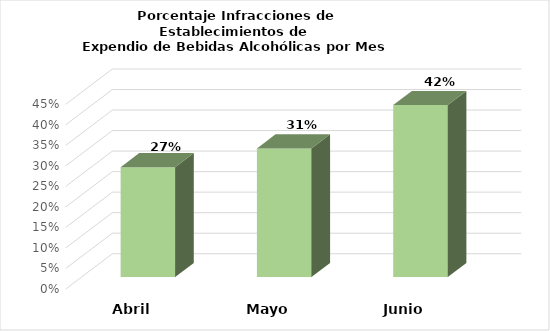
| Category | Series 0 |
|---|---|
| Abril | 0.268 |
| Mayo | 0.313 |
| Junio | 0.419 |